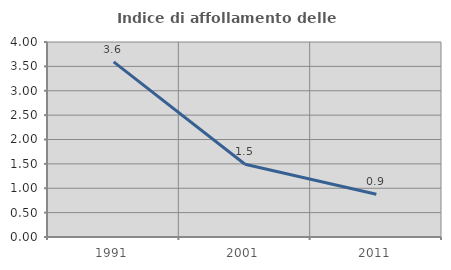
| Category | Indice di affollamento delle abitazioni  |
|---|---|
| 1991.0 | 3.592 |
| 2001.0 | 1.491 |
| 2011.0 | 0.876 |